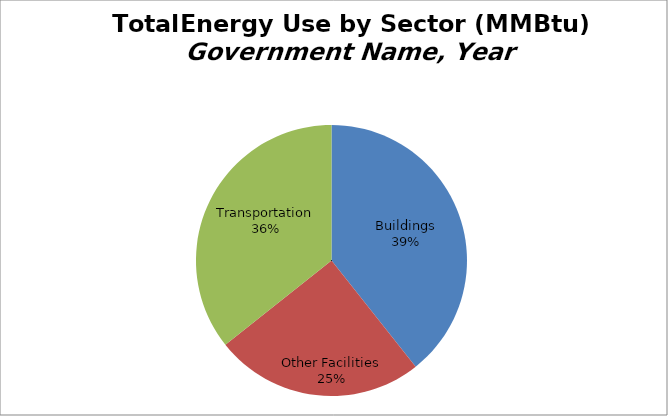
| Category | Series 0 |
|---|---|
| Buildings | 39.332 |
| Other Facilities | 24.988 |
| Transportation | 35.681 |